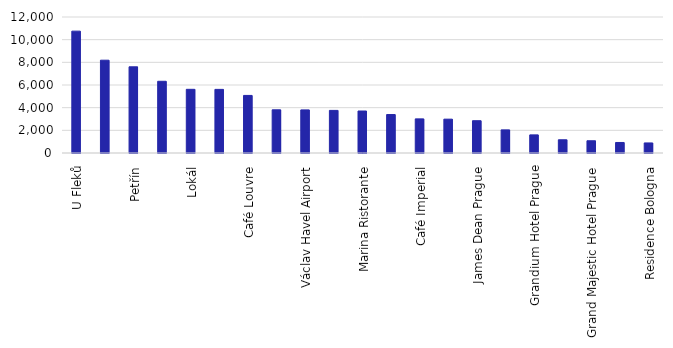
| Category | Number of Google reviews |
|---|---|
| U Fleků | 10753 |
| Prague zoo | 8189 |
| Petřín | 7604 |
| Hard Rock Cafe | 6328 |
| Lokál | 5619 |
| Český Krumlov State Castle and Château  | 5613 |
| Café Louvre | 5080 |
| Kozlovna Apropos | 3811 |
| Václav Havel Airport | 3802 |
| Havelská Koruna | 3759 |
| Marina Ristorante | 3705 |
| Karlštejn | 3394 |
| Café Imperial | 3011 |
| Restaurant U Vejvodů | 2986 |
| James Dean Prague | 2849 |
| Cathedral of St. Barbara | 2040 |
| Grandium Hotel Prague | 1598 |
| ibis Praha Old Town | 1167 |
| Grand Majestic Hotel Prague | 1080 |
| Majestic Plaza Hotel Prague | 928 |
| Residence Bologna | 887 |